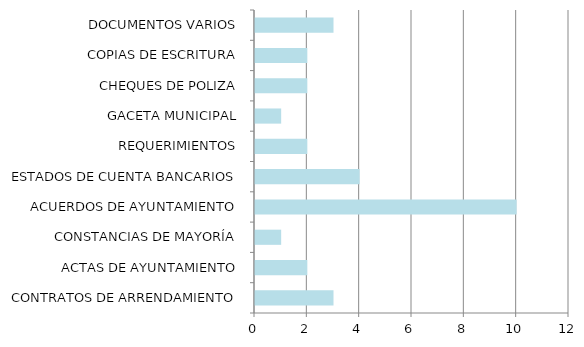
| Category | Series 0 |
|---|---|
| CONTRATOS DE ARRENDAMIENTO | 3 |
| ACTAS DE AYUNTAMIENTO | 2 |
| CONSTANCIAS DE MAYORÍA | 1 |
| ACUERDOS DE AYUNTAMIENTO | 10 |
| ESTADOS DE CUENTA BANCARIOS | 4 |
| REQUERIMIENTOS | 2 |
| GACETA MUNICIPAL | 1 |
| CHEQUES DE POLIZA | 2 |
| COPIAS DE ESCRITURA | 2 |
| DOCUMENTOS VARIOS | 3 |